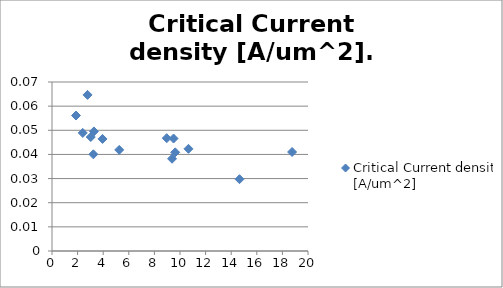
| Category | Critical Current density [A/um^2] |
|---|---|
| 3.232 | 0.04 |
| 2.4034 | 0.049 |
| 1.8748 | 0.056 |
| 3.2761 | 0.05 |
| 3.0272 | 0.047 |
| 2.7782999999999998 | 0.065 |
| 5.252000000000001 | 0.042 |
| 3.9458 | 0.046 |
| 9.3786 | 0.038 |
| 10.660599999999999 | 0.042 |
| 9.625399999999999 | 0.041 |
| 8.9639 | 0.047 |
| 9.495199999999999 | 0.047 |
| 18.7572 | 0.041 |
| 14.649600000000001 | 0.03 |